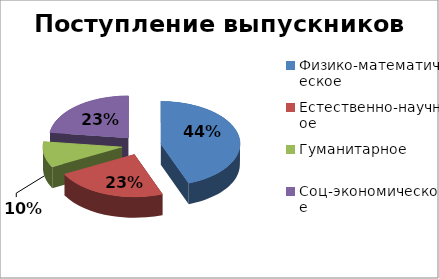
| Category | Series 0 |
|---|---|
| Физико-математическое | 27 |
| Естественно-научное | 14 |
| Гуманитарное | 6 |
| Соц-экономическое | 14 |